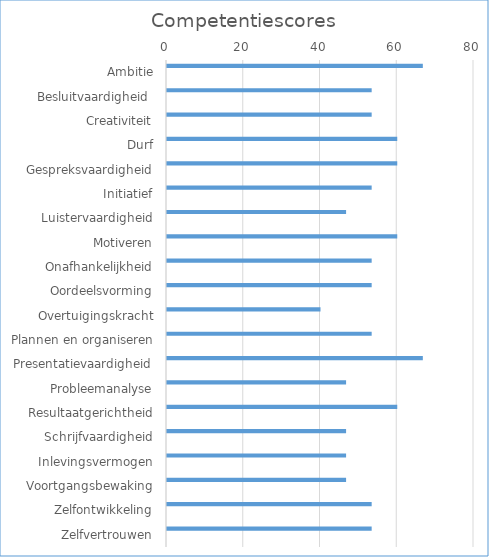
| Category | Series 0 | Series 1 | Series 2 | Series 3 |
|---|---|---|---|---|
| Ambitie | 66.667 | 0 | 0 | 0 |
| Besluitvaardigheid  | 53.333 | 0 | 0 | 0 |
| Creativiteit | 53.333 | 0 | 0 | 0 |
| Durf | 60 | 0 | 0 | 0 |
| Gespreksvaardigheid | 60 | 0 | 0 | 0 |
| Initiatief | 53.333 | 0 | 0 | 0 |
| Luistervaardigheid | 46.667 | 0 | 0 | 0 |
| Motiveren | 60 | 0 | 0 | 0 |
| Onafhankelijkheid | 53.333 | 0 | 0 | 0 |
| Oordeelsvorming | 53.333 | 0 | 0 | 0 |
| Overtuigingskracht | 40 | 0 | 0 | 0 |
| Plannen en organiseren | 53.333 | 0 | 0 | 0 |
| Presentatievaardigheid | 66.667 | 0 | 0 | 0 |
| Probleemanalyse | 46.667 | 0 | 0 | 0 |
| Resultaatgerichtheid | 60 | 0 | 0 | 0 |
| Schrijfvaardigheid | 46.667 | 0 | 0 | 0 |
| Inlevingsvermogen | 46.667 | 0 | 0 | 0 |
| Voortgangsbewaking | 46.667 | 0 | 0 | 0 |
| Zelfontwikkeling | 53.333 | 0 | 0 | 0 |
| Zelfvertrouwen | 53.333 | 0 | 0 | 0 |